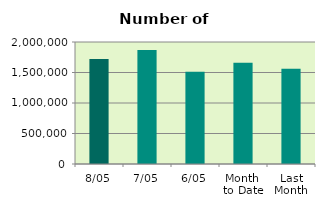
| Category | Series 0 |
|---|---|
| 8/05 | 1722342 |
| 7/05 | 1868166 |
| 6/05 | 1513330 |
| Month 
to Date | 1661723.2 |
| Last
Month | 1561575.6 |